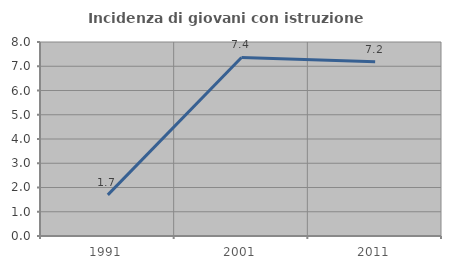
| Category | Incidenza di giovani con istruzione universitaria |
|---|---|
| 1991.0 | 1.695 |
| 2001.0 | 7.362 |
| 2011.0 | 7.182 |